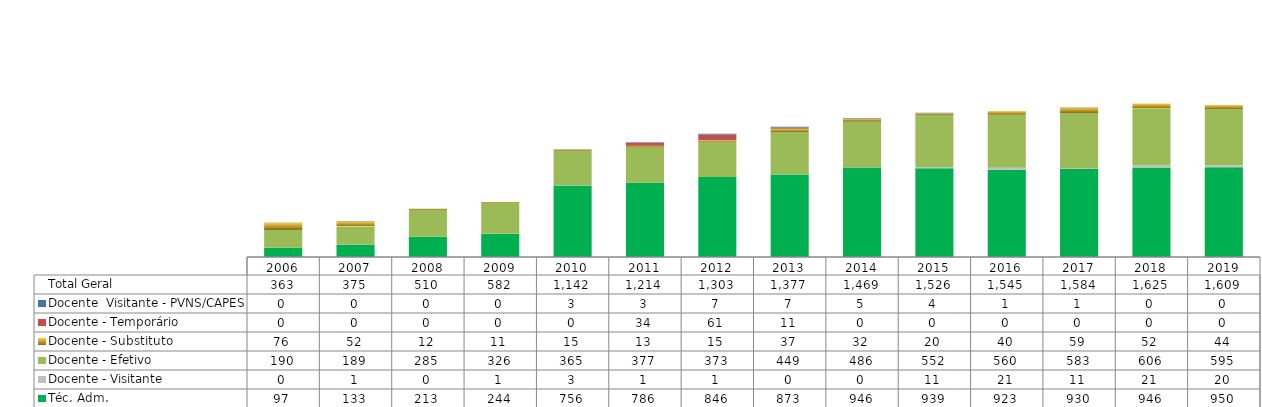
| Category | Téc. Adm. | Docente - Visitante | Docente - Efetivo | Docente - Substituto | Docente - Temporário | Docente  Visitante - PVNS/CAPES | Total Geral |
|---|---|---|---|---|---|---|---|
| 2006.0 | 97 | 0 | 190 | 76 | 0 | 0 | 363 |
| 2007.0 | 133 | 1 | 189 | 52 | 0 | 0 | 375 |
| 2008.0 | 213 | 0 | 285 | 12 | 0 | 0 | 510 |
| 2009.0 | 244 | 1 | 326 | 11 | 0 | 0 | 582 |
| 2010.0 | 756 | 3 | 365 | 15 | 0 | 3 | 1142 |
| 2011.0 | 786 | 1 | 377 | 13 | 34 | 3 | 1214 |
| 2012.0 | 846 | 1 | 373 | 15 | 61 | 7 | 1303 |
| 2013.0 | 873 | 0 | 449 | 37 | 11 | 7 | 1377 |
| 2014.0 | 946 | 0 | 486 | 32 | 0 | 5 | 1469 |
| 2015.0 | 939 | 11 | 552 | 20 | 0 | 4 | 1526 |
| 2016.0 | 923 | 21 | 560 | 40 | 0 | 1 | 1545 |
| 2017.0 | 930 | 11 | 583 | 59 | 0 | 1 | 1584 |
| 2018.0 | 946 | 21 | 606 | 52 | 0 | 0 | 1625 |
| 2019.0 | 950 | 20 | 595 | 44 | 0 | 0 | 1609 |